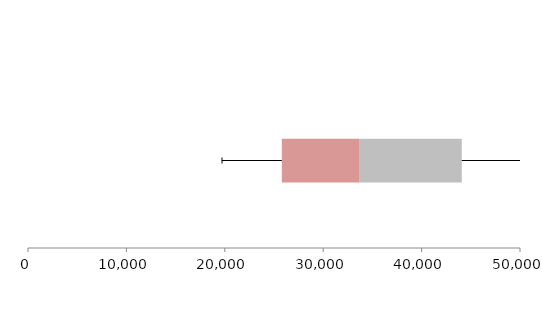
| Category | Series 1 | Series 2 | Series 3 |
|---|---|---|---|
| 0 | 25794.454 | 7846.411 | 10440.265 |